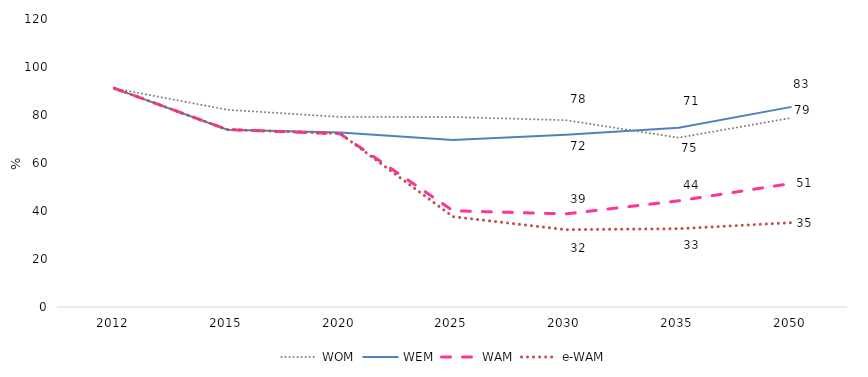
| Category | WOM | WEM | WAM | e-WAM |
|---|---|---|---|---|
| 0 | 91.095 | 91.095 | 91.095 | 91.095 |
| 1 | 82.169 | 73.868 | 73.94 | 73.926 |
| 2 | 79.2 | 72.721 | 72.163 | 72.29 |
| 3 | 79.171 | 69.557 | 40.114 | 37.631 |
| 4 | 77.838 | 71.762 | 38.781 | 32.222 |
| 5 | 70.548 | 74.65 | 44.249 | 32.627 |
| 6 | 78.801 | 83.391 | 51.493 | 35.152 |